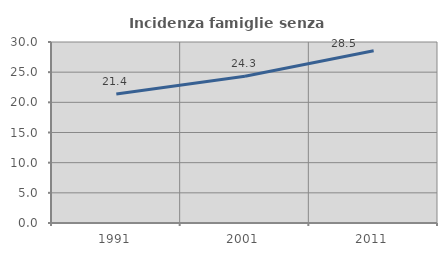
| Category | Incidenza famiglie senza nuclei |
|---|---|
| 1991.0 | 21.4 |
| 2001.0 | 24.334 |
| 2011.0 | 28.547 |